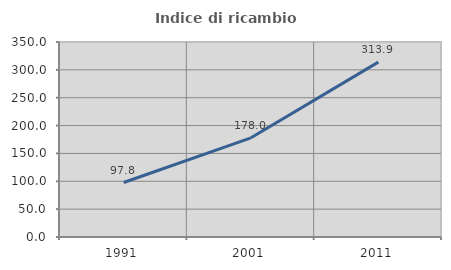
| Category | Indice di ricambio occupazionale  |
|---|---|
| 1991.0 | 97.778 |
| 2001.0 | 178.014 |
| 2011.0 | 313.853 |